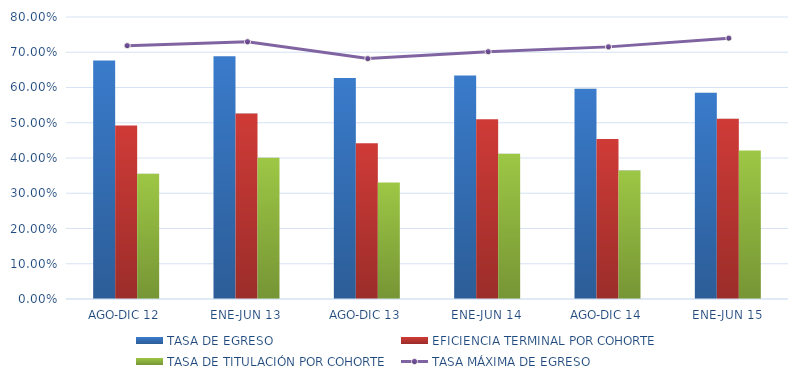
| Category | TASA DE EGRESO | EFICIENCIA TERMINAL POR COHORTE | TASA DE TITULACIÓN POR COHORTE |
|---|---|---|---|
| AGO-DIC 12 | 0.677 | 0.492 | 0.355 |
| ENE-JUN 13 | 0.689 | 0.526 | 0.401 |
| AGO-DIC 13 | 0.627 | 0.442 | 0.331 |
| ENE-JUN 14 | 0.634 | 0.51 | 0.412 |
| AGO-DIC 14 | 0.596 | 0.454 | 0.364 |
| ENE-JUN 15 | 0.585 | 0.511 | 0.421 |